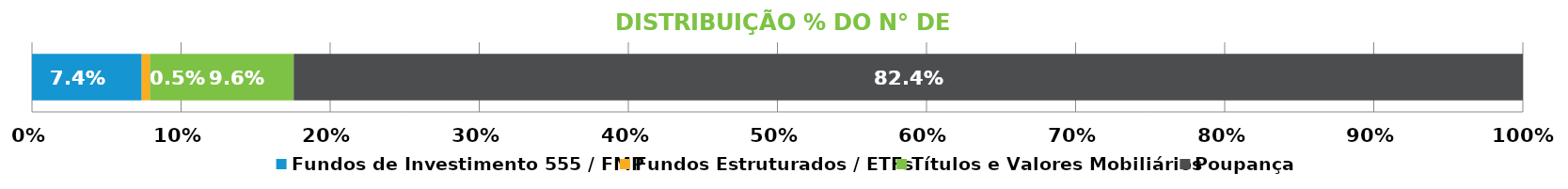
| Category | Fundos de Investimento 555 / FMP | Fundos Estruturados / ETFs | Títulos e Valores Mobiliários | Poupança |
|---|---|---|---|---|
| 0 | 0.074 | 0.005 | 0.096 | 0.824 |